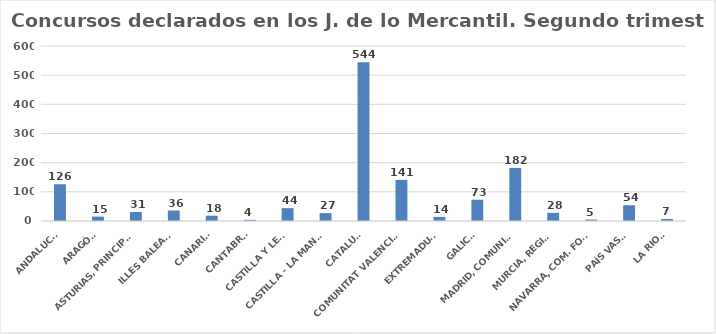
| Category | Series 0 |
|---|---|
| ANDALUCÍA | 126 |
| ARAGÓN | 15 |
| ASTURIAS, PRINCIPADO | 31 |
| ILLES BALEARS | 36 |
| CANARIAS | 18 |
| CANTABRIA | 4 |
| CASTILLA Y LEÓN | 44 |
| CASTILLA - LA MANCHA | 27 |
| CATALUÑA | 544 |
| COMUNITAT VALENCIANA | 141 |
| EXTREMADURA | 14 |
| GALICIA | 73 |
| MADRID, COMUNIDAD | 182 |
| MURCIA, REGIÓN | 28 |
| NAVARRA, COM. FORAL | 5 |
| PAÍS VASCO | 54 |
| LA RIOJA | 7 |